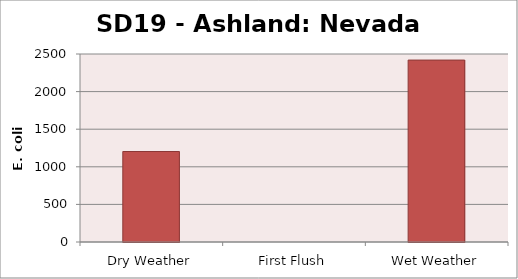
| Category | E. coli MPN |
|---|---|
| Dry Weather | 1203.3 |
| First Flush | 0 |
| Wet Weather | 2419.2 |